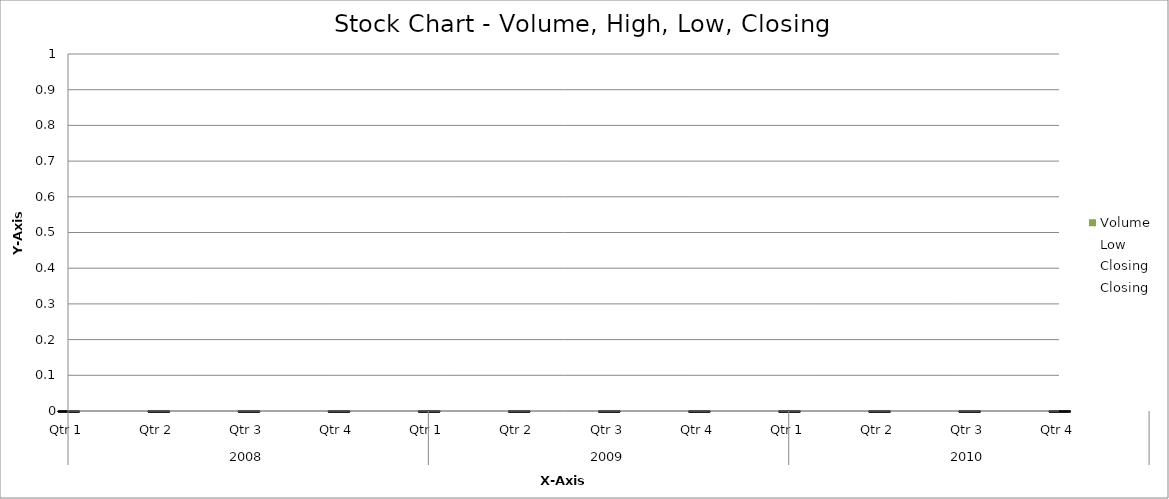
| Category | Volume |
|---|---|
| 0 | 120 |
| 1 | 147 |
| 2 | 133 |
| 3 | 125 |
| 4 | 129 |
| 5 | 141 |
| 6 | 131 |
| 7 | 123 |
| 8 | 148 |
| 9 | 147 |
| 10 | 140 |
| 11 | 149 |